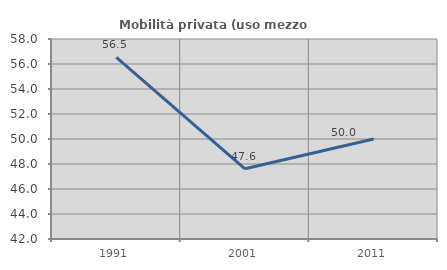
| Category | Mobilità privata (uso mezzo privato) |
|---|---|
| 1991.0 | 56.522 |
| 2001.0 | 47.619 |
| 2011.0 | 50 |